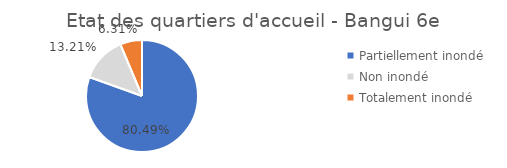
| Category | Individus PDI |
|---|---|
| Partiellement inondé | 0.805 |
| Non inondé | 0.132 |
| Totalement inondé | 0.063 |